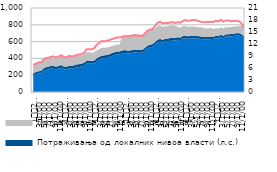
| Category | Учешће потражив. државе у активи банк. сектора (д.с.) |
|---|---|
| 0 | 6.839 |
| 1900-01-01 | 7.017 |
| 1900-01-02 | 7.418 |
| 1900-01-03 | 7.364 |
| 1900-01-04 | 8.042 |
| 1900-01-05 | 8.485 |
| 1900-01-06 | 8.513 |
| 1900-01-07 | 8.834 |
| 1900-01-08 | 8.869 |
| 1900-01-09 | 8.659 |
| 1900-01-10 | 8.863 |
| 1900-01-11 | 9.193 |
| 1900-01-12 | 8.797 |
| 1900-01-13 | 8.62 |
| 1900-01-14 | 9.029 |
| 1900-01-15 | 8.913 |
| 1900-01-16 | 8.913 |
| 1900-01-17 | 9.266 |
| 1900-01-18 | 9.359 |
| 1900-01-19 | 9.5 |
| 1900-01-20 | 9.732 |
| 1900-01-21 | 10.661 |
| 1900-01-22 | 10.684 |
| 1900-01-23 | 10.671 |
| 1900-01-24 | 10.916 |
| 1900-01-25 | 11.783 |
| 1900-01-26 | 12.28 |
| 1900-01-27 | 12.763 |
| 1900-01-28 | 12.665 |
| 1900-01-29 | 12.836 |
| 1900-01-30 | 12.957 |
| 1900-01-31 | 13.236 |
| 1900-02-01 | 13.344 |
| 1900-02-02 | 13.689 |
| 1900-02-03 | 13.61 |
| 1900-02-04 | 13.823 |
| 1900-02-05 | 13.97 |
| 1900-02-06 | 13.925 |
| 1900-02-07 | 13.914 |
| 1900-02-08 | 14.155 |
| 1900-02-09 | 14.225 |
| 1900-02-10 | 14.009 |
| 1900-02-11 | 14.052 |
| 1900-02-12 | 13.985 |
| 1900-02-13 | 14.637 |
| 1900-02-14 | 15.313 |
| 1900-02-15 | 15.622 |
| 1900-02-16 | 15.712 |
| 1900-02-17 | 16.515 |
| 1900-02-18 | 17.298 |
| 1900-02-19 | 17.568 |
| 1900-02-20 | 17.155 |
| 1900-02-21 | 17.245 |
| 1900-02-22 | 17.242 |
| 1900-02-23 | 17.401 |
| 1900-02-24 | 17.435 |
| 1900-02-25 | 17.262 |
| 1900-02-26 | 17.456 |
| 1900-02-27 | 17.319 |
| 1900-02-28 | 17.757 |
| 1900-02-28 | 17.99 |
| 1900-03-01 | 17.808 |
| 1900-03-02 | 17.865 |
| 1900-03-03 | 18.004 |
| 1900-03-04 | 17.943 |
| 1900-03-05 | 17.83 |
| 1900-03-06 | 17.564 |
| 1900-03-07 | 17.456 |
| 1900-03-08 | 17.476 |
| 1900-03-09 | 17.471 |
| 1900-03-10 | 17.536 |
| 1900-03-11 | 17.516 |
| 1900-03-12 | 17.802 |
| 1900-03-13 | 17.655 |
| 1900-03-14 | 18.044 |
| 1900-03-15 | 17.585 |
| 1900-03-16 | 17.9 |
| 1900-03-17 | 17.844 |
| 1900-03-18 | 17.739 |
| 1900-03-19 | 17.73 |
| 1900-03-20 | 17.832 |
| 1900-03-21 | 17.71 |
| 1900-03-22 | 17.266 |
| 1900-03-23 | 16.151 |